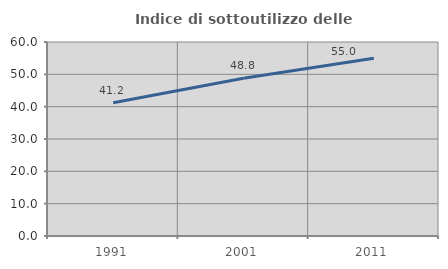
| Category | Indice di sottoutilizzo delle abitazioni  |
|---|---|
| 1991.0 | 41.237 |
| 2001.0 | 48.794 |
| 2011.0 | 54.995 |